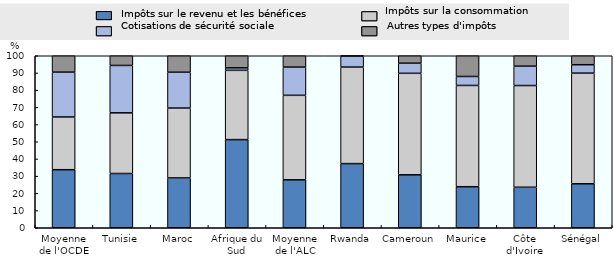
| Category | Impôts sur le revenu et les bénéfices | Impôts sur la consommation | Cotisations de sécurité sociale | Autres types d'impôts |
|---|---|---|---|---|
| Moyenne de l'OCDE | 33.745 | 30.651 | 26.09 | 9.514 |
| Tunisie | 31.548 | 35.273 | 27.551 | 5.628 |
| Maroc | 28.965 | 40.623 | 20.83 | 9.583 |
| Afrique du Sud | 51.24 | 40.275 | 1.451 | 7.033 |
| Moyenne de l'ALC | 27.877 | 49.119 | 16.413 | 6.591 |
| Rwanda | 37.297 | 56.118 | 6.416 | 0.169 |
| Cameroun | 30.78 | 59.018 | 5.896 | 4.306 |
| Maurice | 23.857 | 58.882 | 5.211 | 12.05 |
| Côte d'Ivoire | 23.554 | 59.124 | 11.267 | 6.054 |
| Sénégal | 25.568 | 64.335 | 4.88 | 5.216 |